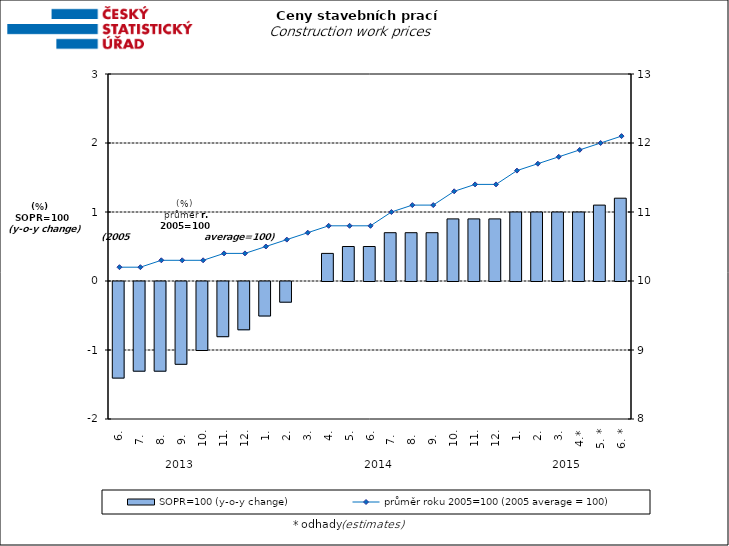
| Category | SOPR=100 (y-o-y change)   |
|---|---|
| 0 | -1.4 |
| 1 | -1.3 |
| 2 | -1.3 |
| 3 | -1.2 |
| 4 | -1 |
| 5 | -0.8 |
| 6 | -0.7 |
| 7 | -0.5 |
| 8 | -0.3 |
| 9 | 0 |
| 10 | 0.4 |
| 11 | 0.5 |
| 12 | 0.5 |
| 13 | 0.7 |
| 14 | 0.7 |
| 15 | 0.7 |
| 16 | 0.9 |
| 17 | 0.9 |
| 18 | 0.9 |
| 19 | 1 |
| 20 | 1 |
| 21 | 1 |
| 22 | 1 |
| 23 | 1.1 |
| 24 | 1.2 |